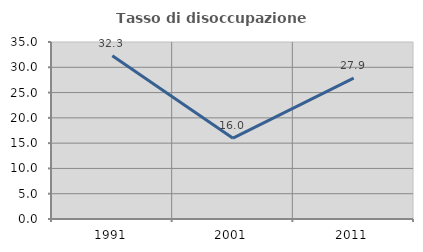
| Category | Tasso di disoccupazione giovanile  |
|---|---|
| 1991.0 | 32.303 |
| 2001.0 | 15.978 |
| 2011.0 | 27.863 |